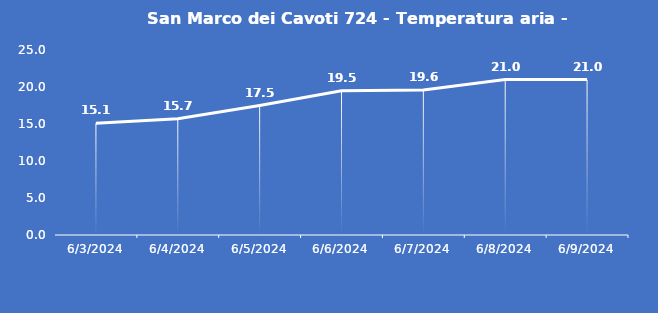
| Category | San Marco dei Cavoti 724 - Temperatura aria - Grezzo (°C) |
|---|---|
| 6/3/24 | 15.1 |
| 6/4/24 | 15.7 |
| 6/5/24 | 17.5 |
| 6/6/24 | 19.5 |
| 6/7/24 | 19.6 |
| 6/8/24 | 21 |
| 6/9/24 | 21 |